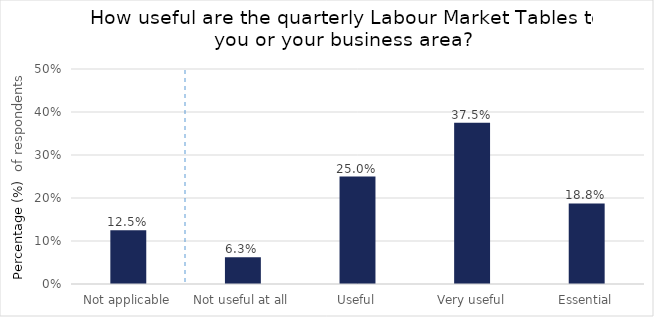
| Category | 12.5% |
|---|---|
| Not applicable | 0.125 |
| Not useful at all | 0.062 |
| Useful | 0.25 |
| Very useful | 0.375 |
| Essential | 0.188 |